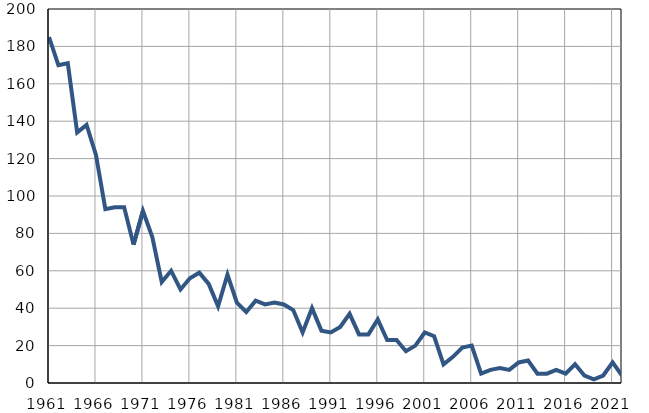
| Category | Умрла 
одојчад |
|---|---|
| 1961.0 | 185 |
| 1962.0 | 170 |
| 1963.0 | 171 |
| 1964.0 | 134 |
| 1965.0 | 138 |
| 1966.0 | 122 |
| 1967.0 | 93 |
| 1968.0 | 94 |
| 1969.0 | 94 |
| 1970.0 | 74 |
| 1971.0 | 92 |
| 1972.0 | 78 |
| 1973.0 | 54 |
| 1974.0 | 60 |
| 1975.0 | 50 |
| 1976.0 | 56 |
| 1977.0 | 59 |
| 1978.0 | 53 |
| 1979.0 | 41 |
| 1980.0 | 58 |
| 1981.0 | 43 |
| 1982.0 | 38 |
| 1983.0 | 44 |
| 1984.0 | 42 |
| 1985.0 | 43 |
| 1986.0 | 42 |
| 1987.0 | 39 |
| 1988.0 | 27 |
| 1989.0 | 40 |
| 1990.0 | 28 |
| 1991.0 | 27 |
| 1992.0 | 30 |
| 1993.0 | 37 |
| 1994.0 | 26 |
| 1995.0 | 26 |
| 1996.0 | 34 |
| 1997.0 | 23 |
| 1998.0 | 23 |
| 1999.0 | 17 |
| 2000.0 | 20 |
| 2001.0 | 27 |
| 2002.0 | 25 |
| 2003.0 | 10 |
| 2004.0 | 14 |
| 2005.0 | 19 |
| 2006.0 | 20 |
| 2007.0 | 5 |
| 2008.0 | 7 |
| 2009.0 | 8 |
| 2010.0 | 7 |
| 2011.0 | 11 |
| 2012.0 | 12 |
| 2013.0 | 5 |
| 2014.0 | 5 |
| 2015.0 | 7 |
| 2016.0 | 5 |
| 2017.0 | 10 |
| 2018.0 | 4 |
| 2019.0 | 2 |
| 2020.0 | 4 |
| 2021.0 | 11 |
| 2022.0 | 4 |